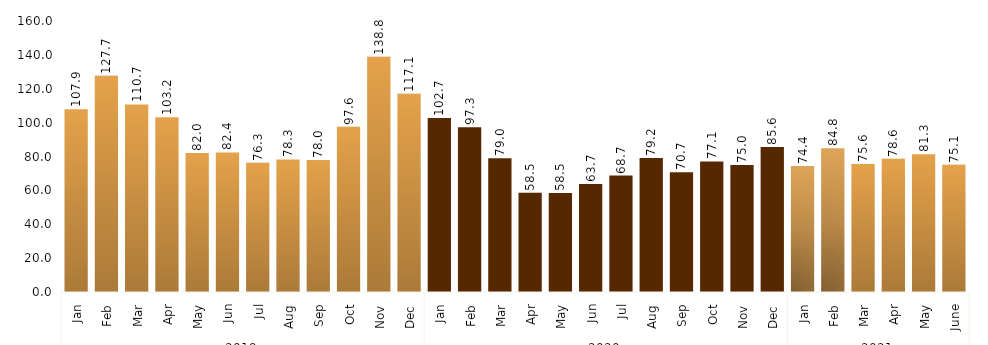
| Category | Series 0 |
|---|---|
| 0 | 107.861 |
| 1 | 127.674 |
| 2 | 110.742 |
| 3 | 103.239 |
| 4 | 82.016 |
| 5 | 82.421 |
| 6 | 76.314 |
| 7 | 78.265 |
| 8 | 77.961 |
| 9 | 97.566 |
| 10 | 138.85 |
| 11 | 117.091 |
| 12 | 102.678 |
| 13 | 97.332 |
| 14 | 78.955 |
| 15 | 58.549 |
| 16 | 58.455 |
| 17 | 63.691 |
| 18 | 68.721 |
| 19 | 79.161 |
| 20 | 70.692 |
| 21 | 77.111 |
| 22 | 74.955 |
| 23 | 85.627 |
| 24 | 74.378 |
| 25 | 84.831 |
| 26 | 75.573 |
| 27 | 78.621 |
| 28 | 81.312 |
| 29 | 75.092 |